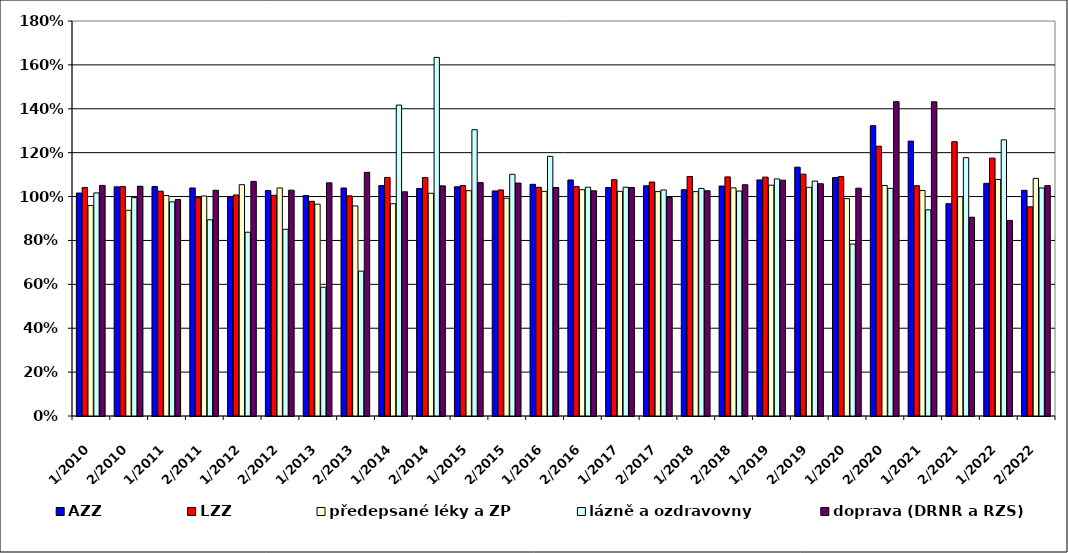
| Category | AZZ | LZZ | předepsané léky a ZP | lázně a ozdravovny | doprava (DRNR a RZS) |
|---|---|---|---|---|---|
| 1/2010 | 1.016 | 1.041 | 0.96 | 1.017 | 1.051 |
| 2/2010 | 1.044 | 1.045 | 0.938 | 0.995 | 1.047 |
| 1/2011 | 1.046 | 1.025 | 1.005 | 0.976 | 0.987 |
| 2/2011 | 1.039 | 0.995 | 1.003 | 0.894 | 1.029 |
| 1/2012 | 0.999 | 1.007 | 1.054 | 0.837 | 1.069 |
| 2/2012 | 1.027 | 1.006 | 1.039 | 0.851 | 1.029 |
| 1/2013 | 1.005 | 0.978 | 0.965 | 0.587 | 1.062 |
| 2/2013 | 1.039 | 1.003 | 0.957 | 0.66 | 1.11 |
| 1/2014 | 1.05 | 1.087 | 0.967 | 1.417 | 1.022 |
| 2/2014 | 1.037 | 1.087 | 1.015 | 1.634 | 1.049 |
| 1/2015 | 1.044 | 1.05 | 1.027 | 1.305 | 1.064 |
| 2/2015 | 1.026 | 1.03 | 0.992 | 1.101 | 1.061 |
| 1/2016 | 1.056 | 1.042 | 1.024 | 1.183 | 1.041 |
| 2/2016 | 1.076 | 1.045 | 1.031 | 1.043 | 1.026 |
| 1/2017 | 1.041 | 1.077 | 1.024 | 1.043 | 1.041 |
| 2/2017 | 1.049 | 1.066 | 1.023 | 1.03 | 0.996 |
| 1/2018 | 1.031 | 1.091 | 1.023 | 1.037 | 1.027 |
| 2/2018 | 1.048 | 1.09 | 1.04 | 1.025 | 1.054 |
| 1/2019 | 1.076 | 1.089 | 1.052 | 1.08 | 1.074 |
| 2/2019 | 1.134 | 1.102 | 1.042 | 1.071 | 1.058 |
| 1/2020 | 1.087 | 1.091 | 0.991 | 0.783 | 1.038 |
| 2/2020 | 1.323 | 1.229 | 1.051 | 1.037 | 1.433 |
| 1/2021 | 1.253 | 1.049 | 1.028 | 0.94 | 1.432 |
| 2/2021 | 0.967 | 1.25 | 1 | 1.177 | 0.906 |
| 1/2022 | 1.06 | 1.175 | 1.078 | 1.258 | 0.891 |
| 2/2022 | 1.028 | 0.953 | 1.083 | 1.039 | 1.05 |